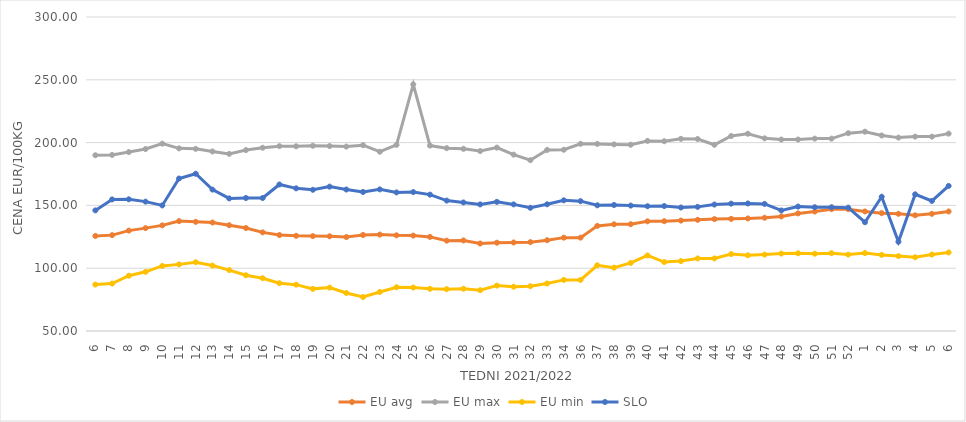
| Category | EU avg | EU max | EU min | SLO |
|---|---|---|---|---|
| 6.0 | 125.679 | 189.94 | 86.97 | 146.03 |
| 7.0 | 126.33 | 190.21 | 87.79 | 154.77 |
| 8.0 | 129.933 | 192.48 | 94.02 | 154.86 |
| 9.0 | 131.908 | 194.884 | 97.12 | 153 |
| 10.0 | 134.098 | 199.17 | 101.79 | 149.98 |
| 11.0 | 137.49 | 195.419 | 103.05 | 171.4 |
| 12.0 | 136.929 | 195.013 | 104.76 | 175.2 |
| 13.0 | 136.39 | 192.952 | 102.11 | 162.57 |
| 14.0 | 134.198 | 191.034 | 98.5 | 155.55 |
| 15.0 | 132.003 | 194.047 | 94.39 | 155.88 |
| 16.0 | 128.53 | 195.913 | 92.04 | 155.88 |
| 17.0 | 126.415 | 197.188 | 88.07 | 166.66 |
| 18.0 | 125.787 | 197.055 | 86.89 | 163.58 |
| 19.0 | 125.54 | 197.478 | 83.546 | 162.44 |
| 20.0 | 125.412 | 197.263 | 84.55 | 164.94 |
| 21.0 | 124.768 | 196.821 | 80.264 | 162.64 |
| 22.0 | 126.43 | 197.963 | 77.048 | 160.68 |
| 23.0 | 126.76 | 192.72 | 81.087 | 162.75 |
| 24.0 | 126.19 | 198.186 | 84.83 | 160.34 |
| 25.0 | 125.97 | 246.36 | 84.63 | 160.6 |
| 26.0 | 124.92 | 197.607 | 83.57 | 158.57 |
| 27.0 | 121.922 | 195.566 | 83.3 | 153.83 |
| 28.0 | 122.106 | 195.043 | 83.64 | 152.35 |
| 29.0 | 119.659 | 193.272 | 82.49 | 150.79 |
| 30.0 | 120.3 | 196.01 | 86.16 | 152.82 |
| 31.0 | 120.473 | 190.42 | 85.26 | 150.8 |
| 32.0 | 120.756 | 186 | 85.65 | 148.1 |
| 33.0 | 122.274 | 194.145 | 87.8 | 150.88 |
| 34.0 | 124.332 | 194.304 | 90.69 | 154.04 |
| 36.0 | 124.332 | 199.06 | 90.69 | 153.37 |
| 37.0 | 133.685 | 198.97 | 102.334 | 150.06 |
| 38.0 | 134.959 | 198.57 | 100.43 | 150.32 |
| 39.0 | 135.021 | 198.3 | 104.21 | 149.86 |
| 40.0 | 137.315 | 201.34 | 110.15 | 149.34 |
| 41.0 | 137.411 | 201.081 | 104.9 | 149.48 |
| 42.0 | 137.908 | 202.98 | 105.65 | 148.32 |
| 43.0 | 138.52 | 202.856 | 107.8 | 148.83 |
| 44.0 | 139.076 | 198.26 | 107.75 | 150.69 |
| 45.0 | 139.275 | 205.257 | 111.25 | 151.41 |
| 46.0 | 139.626 | 207.046 | 110.26 | 151.56 |
| 47.0 | 140.17 | 203.387 | 110.83 | 151.2 |
| 48.0 | 141.2 | 202.42 | 111.62 | 145.97 |
| 49.0 | 143.614 | 202.45 | 111.89 | 149.07 |
| 50.0 | 145.101 | 203.17 | 111.54 | 148.55 |
| 51.0 | 146.984 | 203.17 | 111.93 | 148.54 |
| 52.0 | 146.958 | 207.5 | 110.85 | 148.22 |
| 1.0 | 145.157 | 208.7 | 112.04 | 136.59 |
| 2.0 | 143.842 | 205.67 | 110.59 | 156.88 |
| 3.0 | 143.324 | 203.97 | 109.62 | 121.07 |
| 4.0 | 142.105 | 204.76 | 108.71 | 158.82 |
| 5.0 | 143.269 | 204.76 | 110.86 | 153.55 |
| 6.0 | 145.164 | 207.14 | 112.52 | 165.51 |